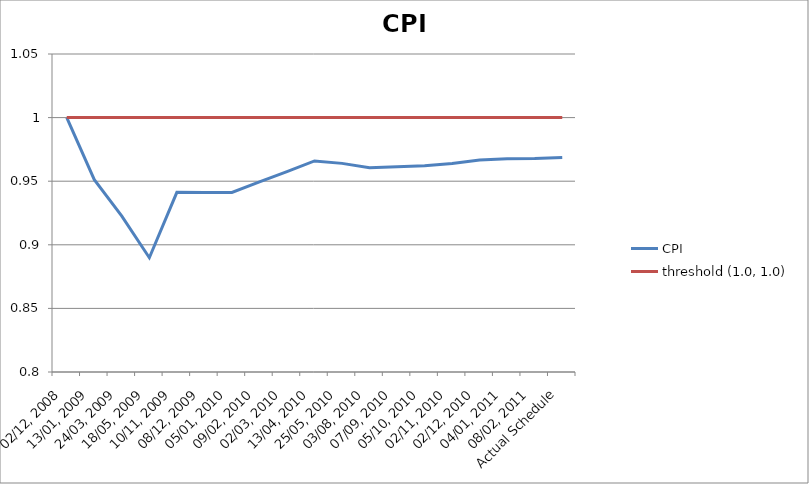
| Category | CPI | threshold (1.0, 1.0) |
|---|---|---|
| 02/12, 2008 | 1 | 1 |
| 13/01, 2009 | 0.951 | 1 |
| 24/03, 2009 | 0.923 | 1 |
| 18/05, 2009 | 0.89 | 1 |
| 10/11, 2009 | 0.941 | 1 |
| 08/12, 2009 | 0.941 | 1 |
| 05/01, 2010 | 0.941 | 1 |
| 09/02, 2010 | 0.949 | 1 |
| 02/03, 2010 | 0.958 | 1 |
| 13/04, 2010 | 0.966 | 1 |
| 25/05, 2010 | 0.964 | 1 |
| 03/08, 2010 | 0.961 | 1 |
| 07/09, 2010 | 0.961 | 1 |
| 05/10, 2010 | 0.962 | 1 |
| 02/11, 2010 | 0.964 | 1 |
| 02/12, 2010 | 0.967 | 1 |
| 04/01, 2011 | 0.968 | 1 |
| 08/02, 2011 | 0.968 | 1 |
| Actual Schedule | 0.969 | 1 |